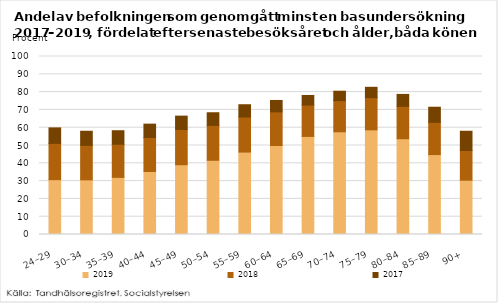
| Category | 2019 | 2018 | 2017 |
|---|---|---|---|
| 24–29 | 30.8 | 20.4 | 8.7 |
| 30–34 | 30.7 | 19.4 | 7.9 |
| 35–39 | 32.1 | 18.6 | 7.6 |
| 40–44 | 35.4 | 19.1 | 7.5 |
| 45–49 | 39.2 | 19.8 | 7.5 |
| 50–54 | 41.7 | 19.6 | 7.1 |
| 55–59 | 46.3 | 19.7 | 6.9 |
| 60–64 | 50 | 18.9 | 6.4 |
| 65–69 | 55.1 | 17.6 | 5.4 |
| 70–74 | 57.7 | 17.5 | 5.3 |
| 75–79 | 58.8 | 18.1 | 5.8 |
| 80–84 | 53.8 | 18.2 | 6.7 |
| 85–89 | 44.9 | 18.1 | 8.5 |
| 90+ | 30.5 | 16.7 | 10.8 |